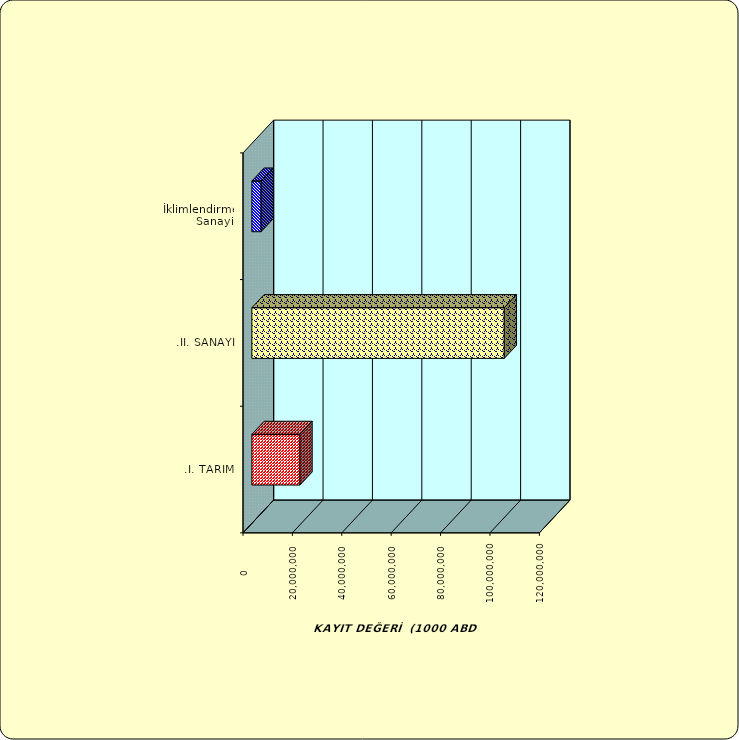
| Category | Series 0 |
|---|---|
| .I. TARIM | 19468318.961 |
| .II. SANAYİ | 102203472.327 |
|  İklimlendirme Sanayii | 3737522.062 |